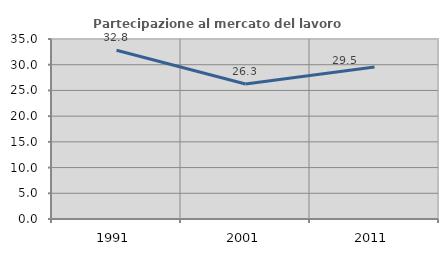
| Category | Partecipazione al mercato del lavoro  femminile |
|---|---|
| 1991.0 | 32.81 |
| 2001.0 | 26.261 |
| 2011.0 | 29.535 |